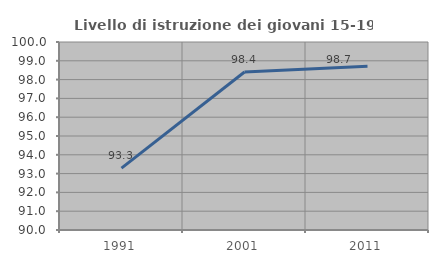
| Category | Livello di istruzione dei giovani 15-19 anni |
|---|---|
| 1991.0 | 93.293 |
| 2001.0 | 98.403 |
| 2011.0 | 98.715 |